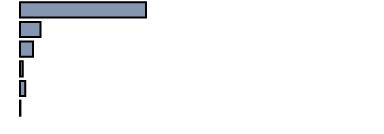
| Category | 53,0 |
|---|---|
| 0 | 35.297 |
| 1 | 5.726 |
| 2 | 3.613 |
| 3 | 0.804 |
| 4 | 1.454 |
| 5 | 0.112 |